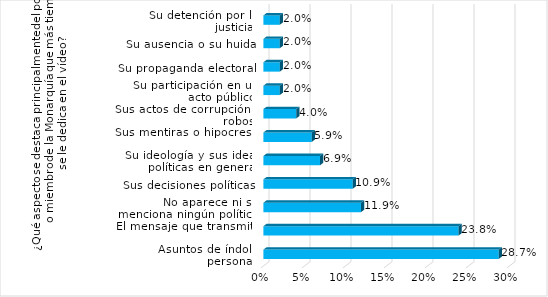
| Category | Series 0 |
|---|---|
| Asuntos de índole personal | 0.287 |
| El mensaje que transmite | 0.238 |
| No aparece ni se menciona ningún político | 0.119 |
| Sus decisiones políticas | 0.109 |
| Su ideología y sus ideas políticas en general | 0.069 |
| Sus mentiras o hipocresía | 0.059 |
| Sus actos de corrupción o robos | 0.04 |
| Su participación en un acto público | 0.02 |
| Su propaganda electoral | 0.02 |
| Su ausencia o su huida | 0.02 |
| Su detención por la justicia | 0.02 |